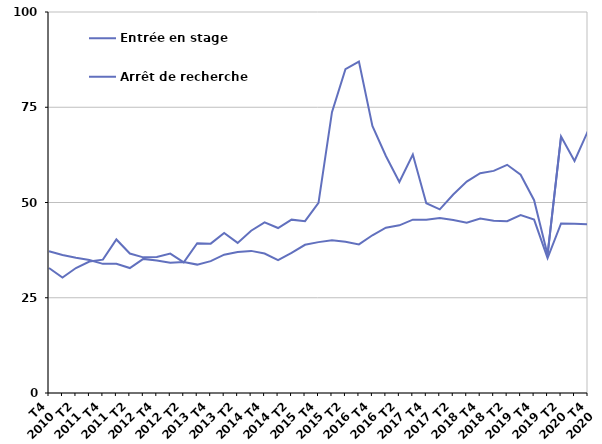
| Category | Entrée en stage | Arrêt de recherche |
|---|---|---|
| T4
2010 | 32.8 | 37.2 |
| T1
2011 | 30.3 | 36.2 |
| T2
2011 | 32.8 | 35.5 |
| T3
2011 | 34.5 | 34.9 |
| T4
2011 | 35 | 33.9 |
| T1
2012 | 40.3 | 33.9 |
| T2
2012 | 36.6 | 32.8 |
| T3
2012 | 35.6 | 35.2 |
| T4
2012 | 35.7 | 34.8 |
| T1
2013 | 36.6 | 34.2 |
| T2
2013 | 34.3 | 34.4 |
| T3
2013 | 39.3 | 33.7 |
| T4
2013 | 39.2 | 34.6 |
| T1
2014 | 42 | 36.3 |
| T2
2014 | 39.4 | 37 |
| T3
2014 | 42.6 | 37.3 |
| T4
2014 | 44.8 | 36.6 |
| T1
2015 | 43.3 | 34.9 |
| T2
2015 | 45.5 | 36.8 |
| T3
2015 | 45.1 | 38.9 |
| T4
2015 | 49.9 | 39.6 |
| T1
2016 | 73.7 | 40.1 |
| T2
2016 | 85 | 39.7 |
| T3
2016 | 87 | 39 |
| T4
2016 | 70.1 | 41.4 |
| T1
2017 | 62.2 | 43.4 |
| T2
2017 | 55.4 | 44 |
| T3
2017 | 62.6 | 45.5 |
| T4
2017 | 49.8 | 45.5 |
| T1
2018 | 48.2 | 45.9 |
| T2
2018 | 52.1 | 45.4 |
| T3
2018 | 55.5 | 44.7 |
| T4
2018 | 57.7 | 45.8 |
| T1
2019 | 58.3 | 45.2 |
| T2
2019 | 59.9 | 45.1 |
| T3
2019 | 57.3 | 46.7 |
| T4
2019 | 50.6 | 45.5 |
| T1
2020 | 36.3 | 35.4 |
| T2
2020 | 67.3 | 44.5 |
| T3
2020 | 60.9 | 44.4 |
| T4
2020 | 68.8 | 44.3 |